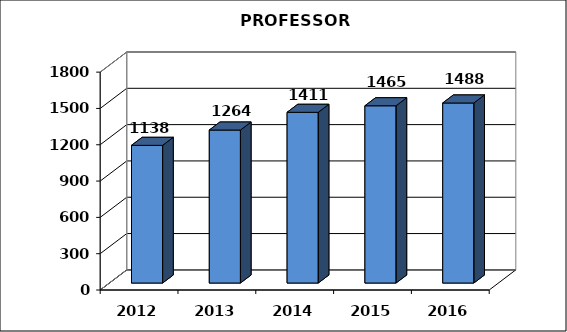
| Category | Series 0 |
|---|---|
| 2012 | 1137.5 |
| 2013 | 1264 |
| 2014 | 1410.5 |
| 2015 | 1464.5 |
| 2016 | 1487.5 |